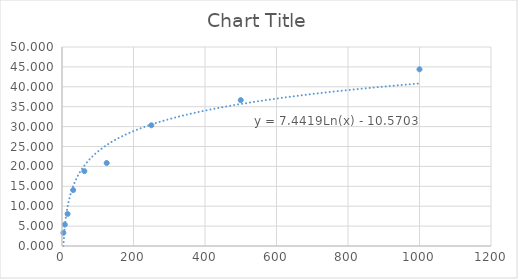
| Category | Series 0 |
|---|---|
| 3.91 | 3.318 |
| 7.81 | 5.371 |
| 15.62 | 8.057 |
| 31.25 | 14.06 |
| 62.5 | 18.799 |
| 125.0 | 20.853 |
| 250.0 | 30.332 |
| 500.0 | 36.651 |
| 1000.0 | 44.392 |